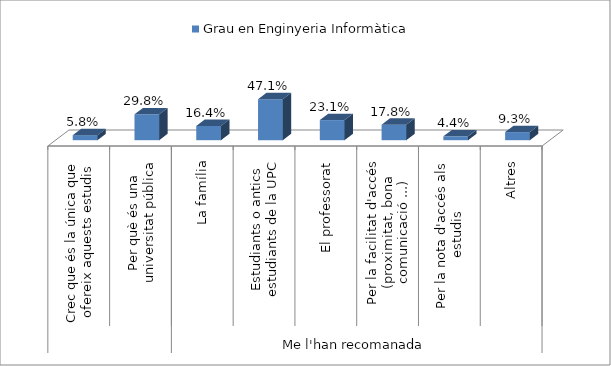
| Category | Grau en Enginyeria Informàtica |
|---|---|
| 0 | 0.058 |
| 1 | 0.298 |
| 2 | 0.164 |
| 3 | 0.471 |
| 4 | 0.231 |
| 5 | 0.178 |
| 6 | 0.044 |
| 7 | 0.093 |